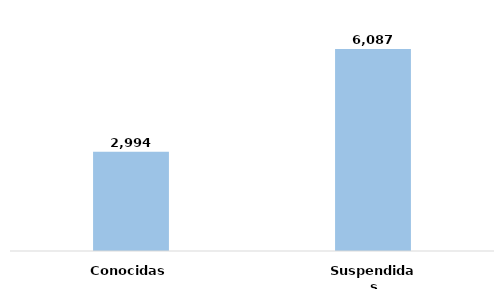
| Category | Series 0 |
|---|---|
| Conocidas | 0.33 |
| Suspendidas | 0.67 |